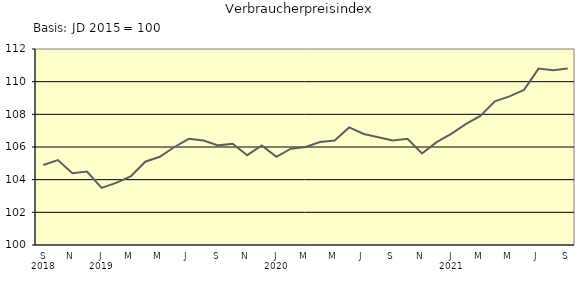
| Category | Series 0 |
|---|---|
| 0 | 104.9 |
| 1 | 105.2 |
| 2 | 104.4 |
| 3 | 104.5 |
| 4 | 103.5 |
| 5 | 103.8 |
| 6 | 104.2 |
| 7 | 105.1 |
| 8 | 105.4 |
| 9 | 106 |
| 10 | 106.5 |
| 11 | 106.4 |
| 12 | 106.1 |
| 13 | 106.2 |
| 14 | 105.5 |
| 15 | 106.1 |
| 16 | 105.4 |
| 17 | 105.9 |
| 18 | 106 |
| 19 | 106.3 |
| 20 | 106.4 |
| 21 | 107.2 |
| 22 | 106.8 |
| 23 | 106.6 |
| 24 | 106.4 |
| 25 | 106.5 |
| 26 | 105.6 |
| 27 | 106.3 |
| 28 | 106.8 |
| 29 | 107.4 |
| 30 | 107.9 |
| 31 | 108.8 |
| 32 | 109.1 |
| 33 | 109.5 |
| 34 | 110.8 |
| 35 | 110.7 |
| 36 | 110.8 |